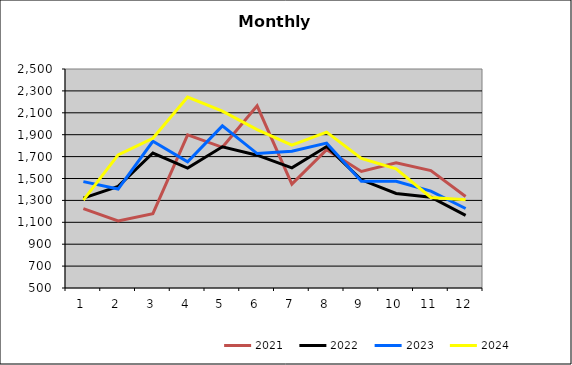
| Category | 2021 | 2022 | 2023 | 2024 |
|---|---|---|---|---|
| 0 | 1224.945 | 1320.378 | 1471.48 | 1303.286 |
| 1 | 1112.955 | 1427.347 | 1403.484 | 1715.816 |
| 2 | 1179.01 | 1732.641 | 1839.49 | 1866.838 |
| 3 | 1897.827 | 1594.906 | 1651.527 | 2243.649 |
| 4 | 1784.624 | 1789.593 | 1980.747 | 2115.04 |
| 5 | 2163.63 | 1712.772 | 1727.791 | 1946.764 |
| 6 | 1448.352 | 1597.715 | 1748.676 | 1803.978 |
| 7 | 1763.243 | 1792.018 | 1822.869 | 1923.841 |
| 8 | 1564.861 | 1487.937 | 1475.586 | 1684.098 |
| 9 | 1643.384 | 1362.939 | 1474.88 | 1588.121 |
| 10 | 1572.259 | 1328.637 | 1384.923 | 1326.598 |
| 11 | 1336.135 | 1163.728 | 1226.284 | 1306.435 |